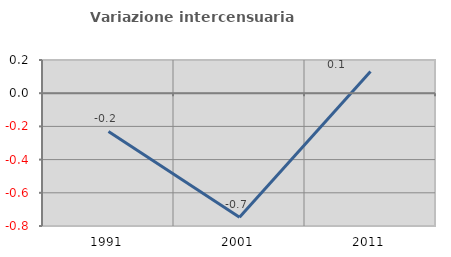
| Category | Variazione intercensuaria annua |
|---|---|
| 1991.0 | -0.23 |
| 2001.0 | -0.748 |
| 2011.0 | 0.13 |